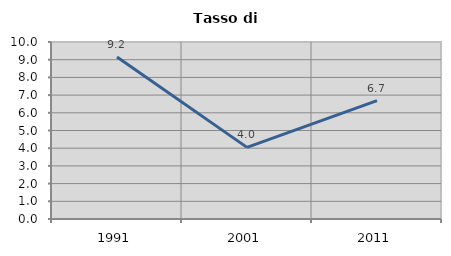
| Category | Tasso di disoccupazione   |
|---|---|
| 1991.0 | 9.151 |
| 2001.0 | 4.047 |
| 2011.0 | 6.69 |